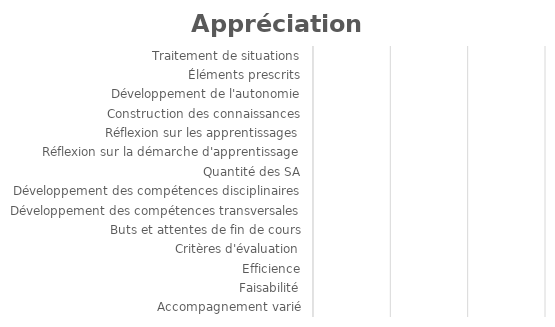
| Category | Series 0 |
|---|---|
| Traitement de situations | 0 |
| Éléments prescrits | 0 |
| Développement de l'autonomie | 0 |
| Construction des connaissances | 0 |
| Réflexion sur les apprentissages | 0 |
| Réflexion sur la démarche d'apprentissage | 0 |
| Quantité des SA | 0 |
| Développement des compétences disciplinaires | 0 |
| Développement des compétences transversales | 0 |
| Buts et attentes de fin de cours | 0 |
| Critères d'évaluation | 0 |
| Efficience | 0 |
| Faisabilité | 0 |
| Accompagnement varié | 0 |